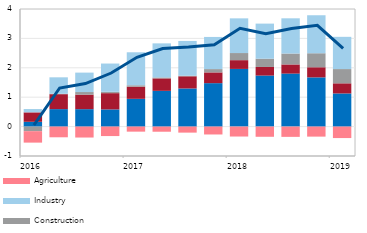
| Category | Other sectors | Trade | Construction | Industry | Agriculture |
|---|---|---|---|---|---|
| 2016 | 0.163 | 0.321 | -0.156 | 0.113 | -0.39 |
| II | 0.595 | 0.508 | 0.015 | 0.558 | -0.363 |
| III | 0.594 | 0.494 | 0.088 | 0.66 | -0.372 |
| IV | 0.585 | 0.553 | 0.046 | 0.96 | -0.322 |
| 2017 | 0.945 | 0.413 | 0.049 | 1.121 | -0.172 |
| II | 1.216 | 0.424 | 0.032 | 1.158 | -0.174 |
| III | 1.297 | 0.414 | 0.02 | 1.182 | -0.205 |
| IV | 1.478 | 0.366 | 0.113 | 1.094 | -0.268 |
| 2018 | 1.962 | 0.298 | 0.242 | 1.18 | -0.338 |
| II | 1.736 | 0.292 | 0.281 | 1.193 | -0.346 |
| III | 1.803 | 0.311 | 0.372 | 1.197 | -0.349 |
| IV | 1.675 | 0.344 | 0.476 | 1.292 | -0.341 |
| 2019 | 1.127 | 0.345 | 0.485 | 1.097 | -0.39 |